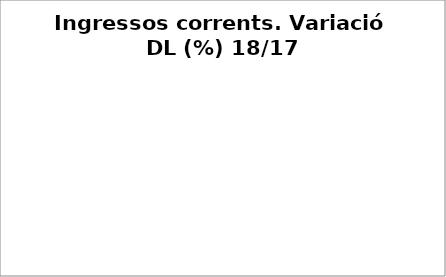
| Category | Series 0 |
|---|---|
| Impostos locals | -0.024 |
| Participació Tributs de l'Estat | 0.057 |
| Taxes i altres ingressos | 0.144 |
| Transferències corrents (exc. FCF) | 0.145 |
| Ingressos patrimonials | -0.188 |
| Ingressos corrents | 0.016 |